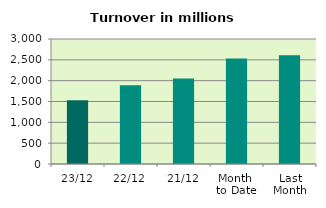
| Category | Series 0 |
|---|---|
| 23/12 | 1532.182 |
| 22/12 | 1892.422 |
| 21/12 | 2050.985 |
| Month 
to Date | 2534.399 |
| Last
Month | 2611.78 |